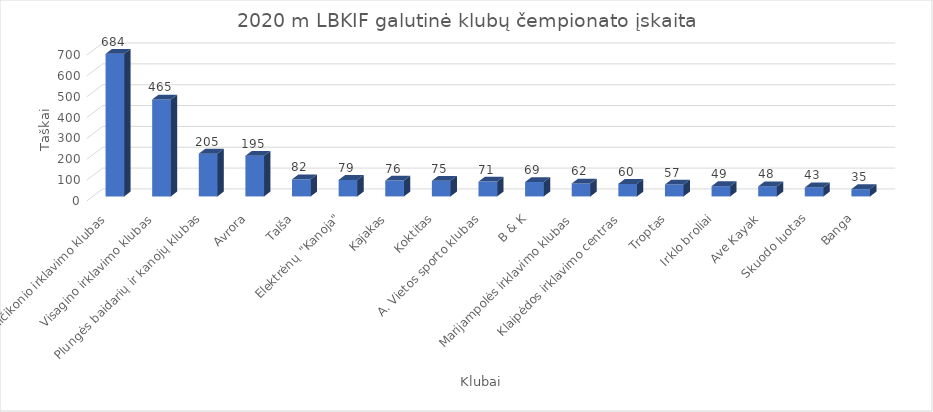
| Category | Series 0 |
|---|---|
| V. Vaičikonio irklavimo klubas | 684 |
| Visagino irklavimo klubas | 465 |
| Plungės baidarių ir kanojų klubas | 205 |
| Avrora | 195 |
| Talša | 82 |
| Elektrėnų "Kanoja" | 79 |
| Kajakas | 76 |
| Koktitas | 75 |
| A. Vietos sporto klubas | 71 |
| B & K | 69 |
| Marijampolės irklavimo klubas | 62 |
| Klaipėdos irklavimo centras | 60 |
| Troptas | 57 |
| Irklo broliai | 49 |
| Ave Kayak | 48 |
| Skuodo luotas | 43 |
| Banga | 35 |